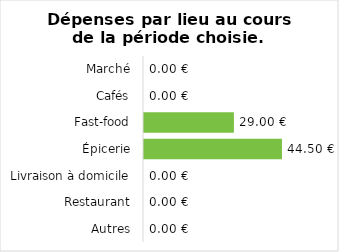
| Category | Dépenses |
|---|---|
| Marché | 0 |
| Cafés | 0 |
| Fast-food | 29 |
| Épicerie | 44.5 |
| Livraison à domicile | 0 |
| Restaurant | 0 |
| Autres | 0 |